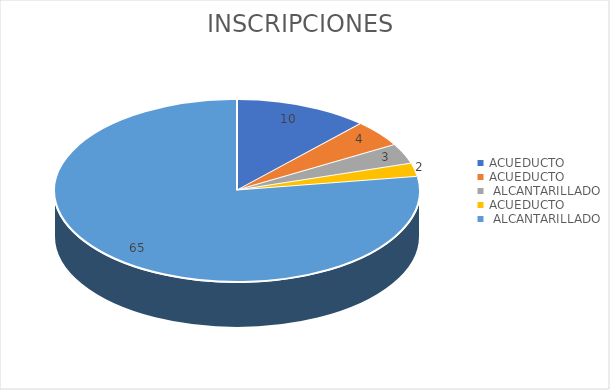
| Category | INSCRIPCION |
|---|---|
| ACUEDUCTO | 10 |
| ACUEDUCTO, ALCANTARILLADO | 4 |
| ACUEDUCTO, ALCANTARILLADO, ASEO | 3 |
| ALCANTARILLADO | 2 |
| ASEO | 65 |